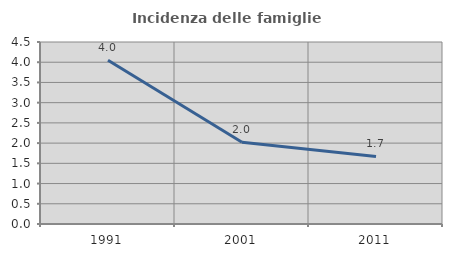
| Category | Incidenza delle famiglie numerose |
|---|---|
| 1991.0 | 4.049 |
| 2001.0 | 2.021 |
| 2011.0 | 1.67 |